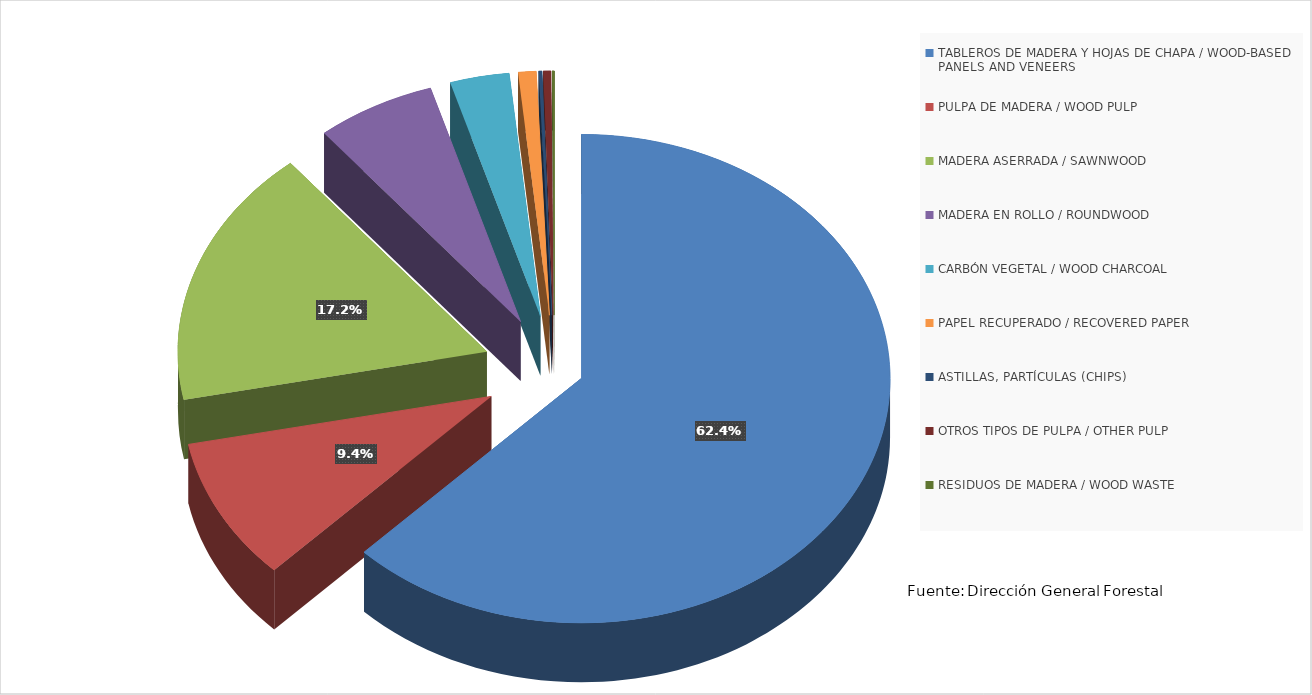
| Category | Series 0 |
|---|---|
| TABLEROS DE MADERA Y HOJAS DE CHAPA / WOOD-BASED PANELS AND VENEERS | 30671.3 |
| PULPA DE MADERA / WOOD PULP | 4638.852 |
| MADERA ASERRADA / SAWNWOOD | 8444.437 |
| MADERA EN ROLLO / ROUNDWOOD | 3074.353 |
| CARBÓN VEGETAL / WOOD CHARCOAL | 1521.997 |
| PAPEL RECUPERADO / RECOVERED PAPER | 458.989 |
| ASTILLAS, PARTÍCULAS (CHIPS) | 83.613 |
| OTROS TIPOS DE PULPA / OTHER PULP | 193.722 |
| RESIDUOS DE MADERA / WOOD WASTE | 58.874 |